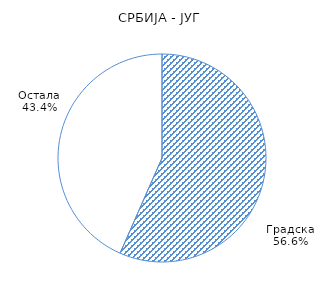
| Category | Series 0 |
|---|---|
| Градска | 56.6 |
| Остала | 43.4 |